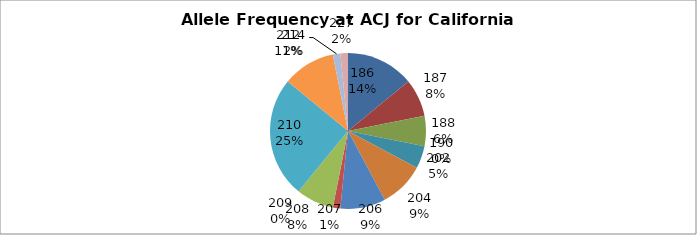
| Category | Series 0 |
|---|---|
| 186.0 | 0.141 |
| 187.0 | 0.078 |
| 188.0 | 0.062 |
| 190.0 | 0 |
| 202.0 | 0.047 |
| 204.0 | 0.094 |
| 206.0 | 0.094 |
| 207.0 | 0.016 |
| 208.0 | 0.078 |
| 209.0 | 0 |
| 210.0 | 0.25 |
| 212.0 | 0.109 |
| 214.0 | 0.016 |
| 227.0 | 0.016 |